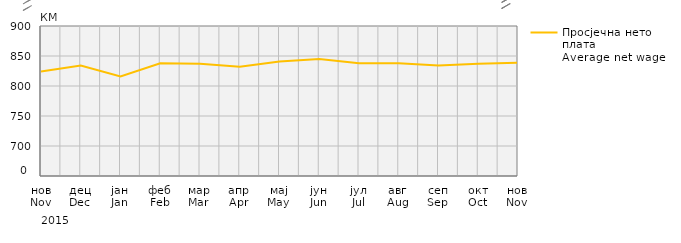
| Category | Просјечна нето плата
Average net wage |
|---|---|
| нов
Nov | 824 |
| дец
Dec | 834 |
| јан
Jan | 816 |
| феб
Feb | 838 |
| мар
Mar | 837 |
| апр
Apr | 832 |
| мај
May | 841 |
| јун
Jun | 845 |
| јул
Jul | 838 |
| авг
Aug | 838 |
| сеп
Sep | 834 |
| окт
Oct | 837 |
| нов
Nov | 839 |